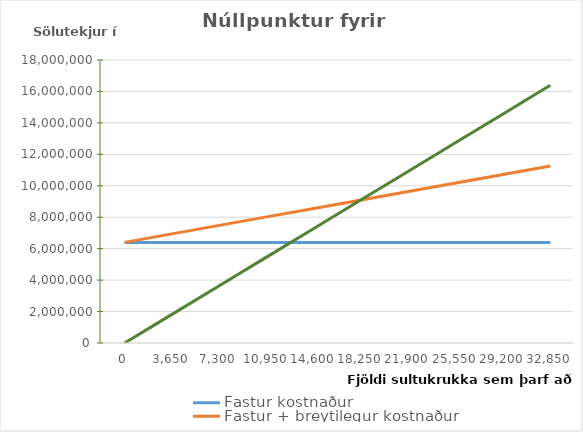
| Category | Fastur kostnaður | Fastur + breytilegur kostnaður | Sölutekjur |
|---|---|---|---|
| 0.0 | 6400000 | 6400000 | 0 |
| 3650.0 | 6400000 | 6940200 | 1821350 |
| 7300.0 | 6400000 | 7480400 | 3642700 |
| 10950.0 | 6400000 | 8020600 | 5464050 |
| 14600.0 | 6400000 | 8560800 | 7285400 |
| 18250.0 | 6400000 | 9101000 | 9106750 |
| 21900.0 | 6400000 | 9641200 | 10928100 |
| 25550.0 | 6400000 | 10181400 | 12749450 |
| 29200.0 | 6400000 | 10721600 | 14570800 |
| 32850.0 | 6400000 | 11261800 | 16392150 |